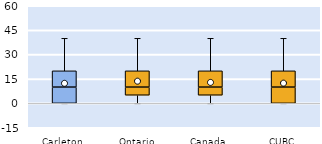
| Category | 25th | 50th | 75th |
|---|---|---|---|
| Carleton | 0 | 10 | 10 |
| Ontario | 5 | 5 | 10 |
| Canada | 5 | 5 | 10 |
| CUBC | 0 | 10 | 10 |